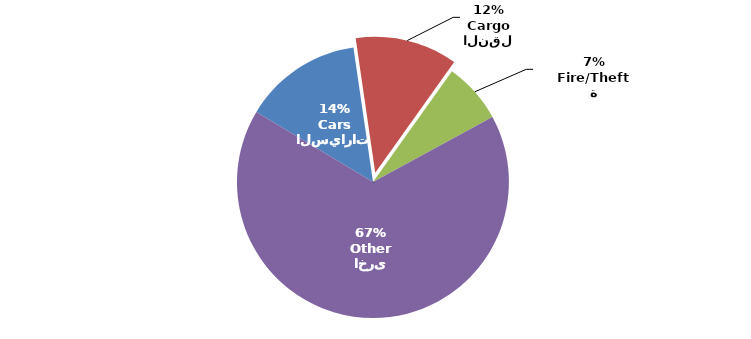
| Category | Series 0 |
|---|---|
| السيارات
Cars | 463468 |
| النقل
Cargo | 399823 |
| الحريق/السرقة
Fire/Theft | 237102 |
| اخرى
Other | 2189060 |